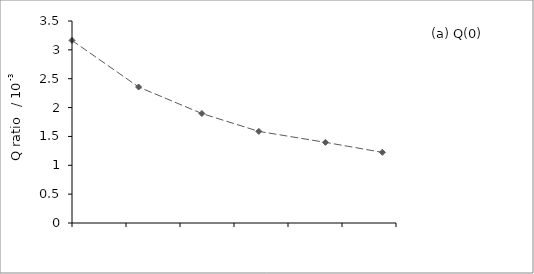
| Category | average |
|---|---|
| 0.0 | 3.163 |
| 0.6167266379343703 | 2.356 |
| 1.2026169439720222 | 1.897 |
| 1.7299182194059088 | 1.587 |
| 2.346644857340279 | 1.398 |
| 2.8739461327741656 | 1.224 |